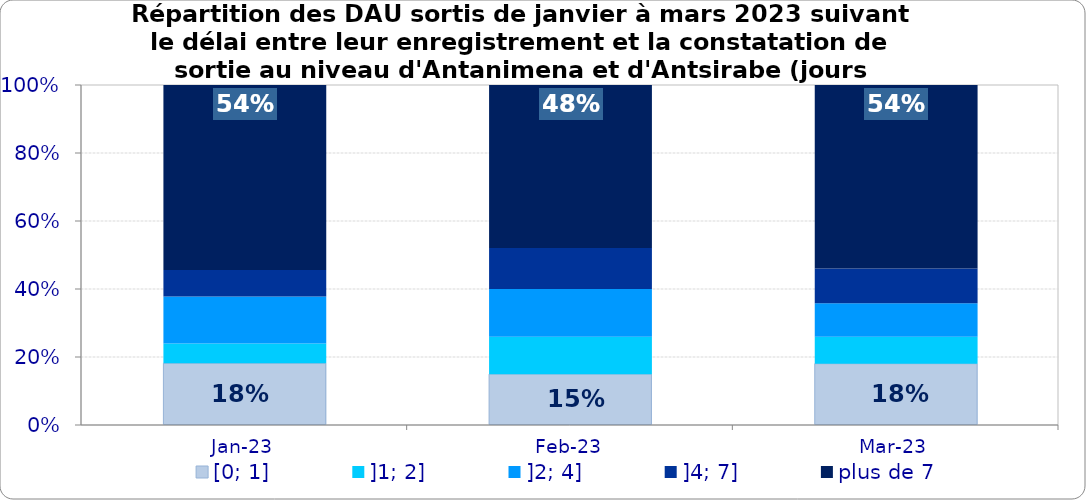
| Category | [0; 1] | ]1; 2] | ]2; 4] | ]4; 7] | plus de 7 |
|---|---|---|---|---|---|
| 2023-01-01 | 0.182 | 0.058 | 0.138 | 0.078 | 0.544 |
| 2023-02-01 | 0.15 | 0.11 | 0.141 | 0.121 | 0.479 |
| 2023-03-01 | 0.18 | 0.079 | 0.099 | 0.102 | 0.54 |